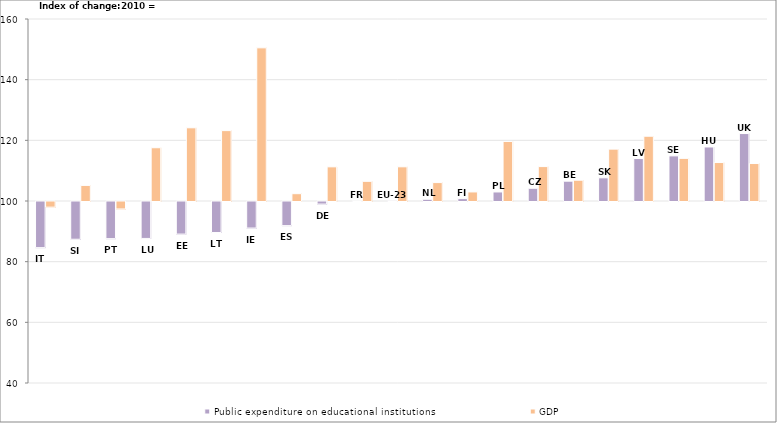
| Category | Public expenditure on educational institutions | GDP |
|---|---|---|
| IT | 84.79 | 98.136 |
| SI | 87.56 | 105.139 |
| PT | 87.758 | 97.541 |
| LU | 87.823 | 117.556 |
| EE | 89.258 | 124.132 |
| LT | 89.772 | 123.201 |
| IE | 91.252 | 150.492 |
| ES | 92.048 | 102.407 |
| DE | 99.153 | 111.26 |
| FR | 100.004 | 106.48 |
| EU-23 | 100.052 | 111.271 |
| NL | 100.575 | 106.072 |
| FI | 100.786 | 102.985 |
| PL | 102.982 | 119.627 |
| CZ | 104.188 | 111.346 |
| BE | 106.536 | 106.856 |
| SK | 107.641 | 117.098 |
| LV | 113.997 | 121.355 |
| SE | 114.878 | 114.057 |
| HU | 117.809 | 112.682 |
| UK | 122.233 | 112.357 |